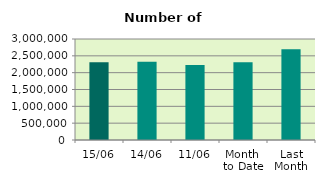
| Category | Series 0 |
|---|---|
| 15/06 | 2306080 |
| 14/06 | 2322622 |
| 11/06 | 2231128 |
| Month 
to Date | 2310158.364 |
| Last
Month | 2692139.333 |